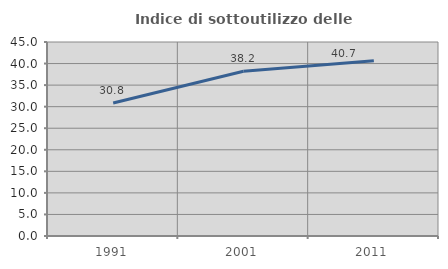
| Category | Indice di sottoutilizzo delle abitazioni  |
|---|---|
| 1991.0 | 30.845 |
| 2001.0 | 38.232 |
| 2011.0 | 40.671 |